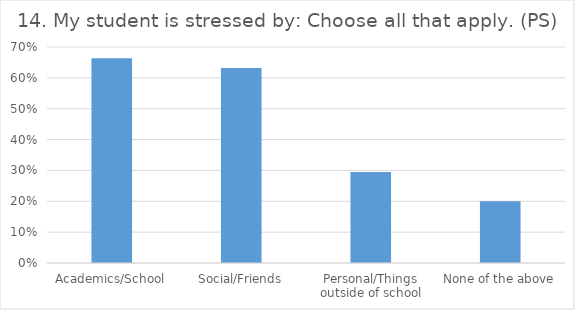
| Category | 14. My student is stressed by: Choose all that apply. (PS) |
|---|---|
| Academics/School | 0.663 |
| Social/Friends | 0.632 |
| Personal/Things outside of school | 0.295 |
| None of the above | 0.2 |